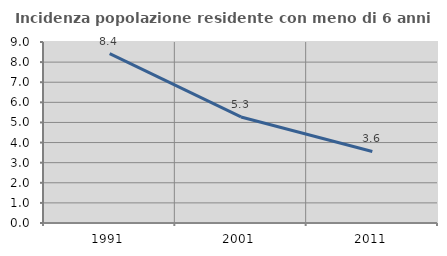
| Category | Incidenza popolazione residente con meno di 6 anni |
|---|---|
| 1991.0 | 8.425 |
| 2001.0 | 5.274 |
| 2011.0 | 3.558 |